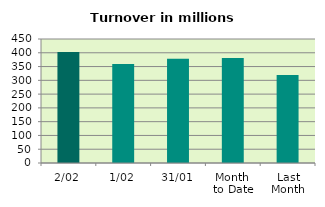
| Category | Series 0 |
|---|---|
| 2/02 | 403.086 |
| 1/02 | 359.268 |
| 31/01 | 378.613 |
| Month 
to Date | 381.177 |
| Last
Month | 318.977 |